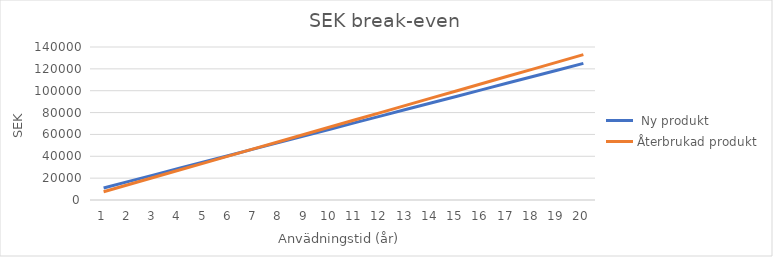
| Category |  Ny produkt | Återbrukad produkt |
|---|---|---|
| 0 | 11000 | 7600 |
| 1 | 17000 | 14200 |
| 2 | 23000 | 20800 |
| 3 | 29000 | 27400 |
| 4 | 35000 | 34000 |
| 5 | 41000 | 40600 |
| 6 | 47000 | 47200 |
| 7 | 53000 | 53800 |
| 8 | 59000 | 60400 |
| 9 | 65000 | 67000 |
| 10 | 71000 | 73600 |
| 11 | 77000 | 80200 |
| 12 | 83000 | 86800 |
| 13 | 89000 | 93400 |
| 14 | 95000 | 100000 |
| 15 | 101000 | 106600 |
| 16 | 107000 | 113200 |
| 17 | 113000 | 119800 |
| 18 | 119000 | 126400 |
| 19 | 125000 | 133000 |